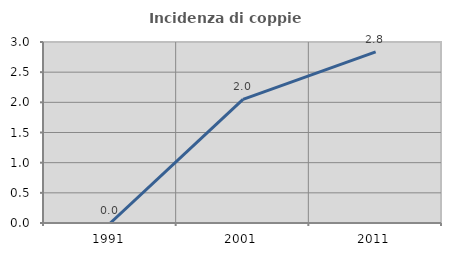
| Category | Incidenza di coppie miste |
|---|---|
| 1991.0 | 0 |
| 2001.0 | 2.048 |
| 2011.0 | 2.837 |